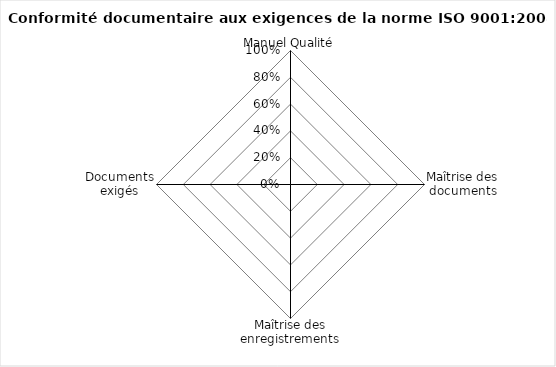
| Category | Conformité |
|---|---|
| Manuel Qualité | 0 |
| Maîtrise des documents | 0 |
| Maîtrise des enregistrements | 0 |
| Documents exigés | 0 |